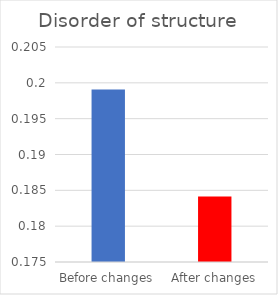
| Category | Series 0 |
|---|---|
| Before changes | 0.199 |
| After changes | 0.184 |